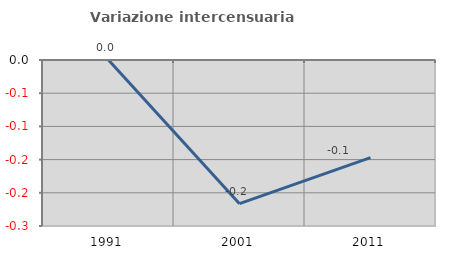
| Category | Variazione intercensuaria annua |
|---|---|
| 1991.0 | 0 |
| 2001.0 | -0.216 |
| 2011.0 | -0.147 |